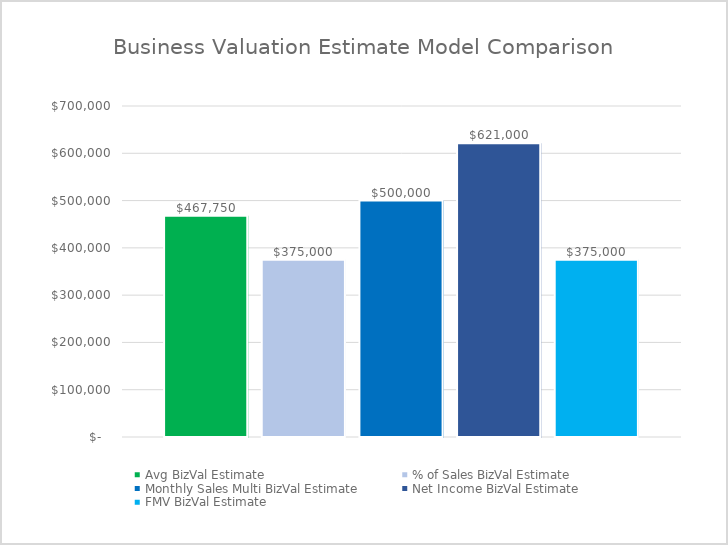
| Category | Avg BizVal Estimate | % of Sales BizVal Estimate | Monthly Sales Multi BizVal Estimate | Net Income BizVal Estimate | FMV BizVal Estimate |
|---|---|---|---|---|---|
| 0 | 467750 | 375000 | 500000 | 621000 | 375000 |